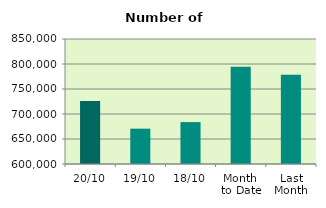
| Category | Series 0 |
|---|---|
| 20/10 | 725828 |
| 19/10 | 670646 |
| 18/10 | 683800 |
| Month 
to Date | 794747.429 |
| Last
Month | 778605.273 |